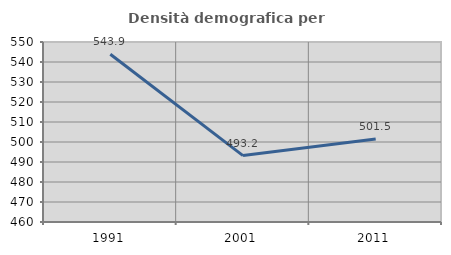
| Category | Densità demografica |
|---|---|
| 1991.0 | 543.902 |
| 2001.0 | 493.21 |
| 2011.0 | 501.525 |